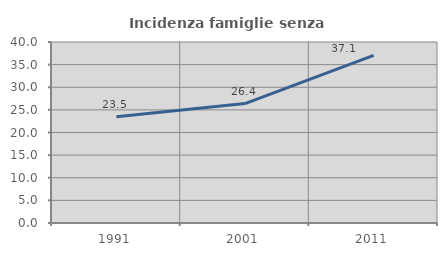
| Category | Incidenza famiglie senza nuclei |
|---|---|
| 1991.0 | 23.467 |
| 2001.0 | 26.397 |
| 2011.0 | 37.064 |